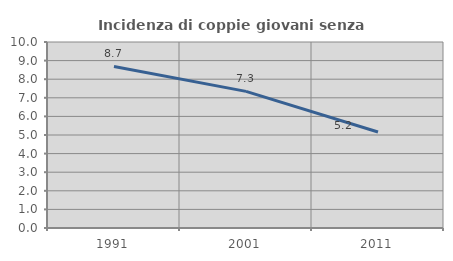
| Category | Incidenza di coppie giovani senza figli |
|---|---|
| 1991.0 | 8.686 |
| 2001.0 | 7.345 |
| 2011.0 | 5.161 |